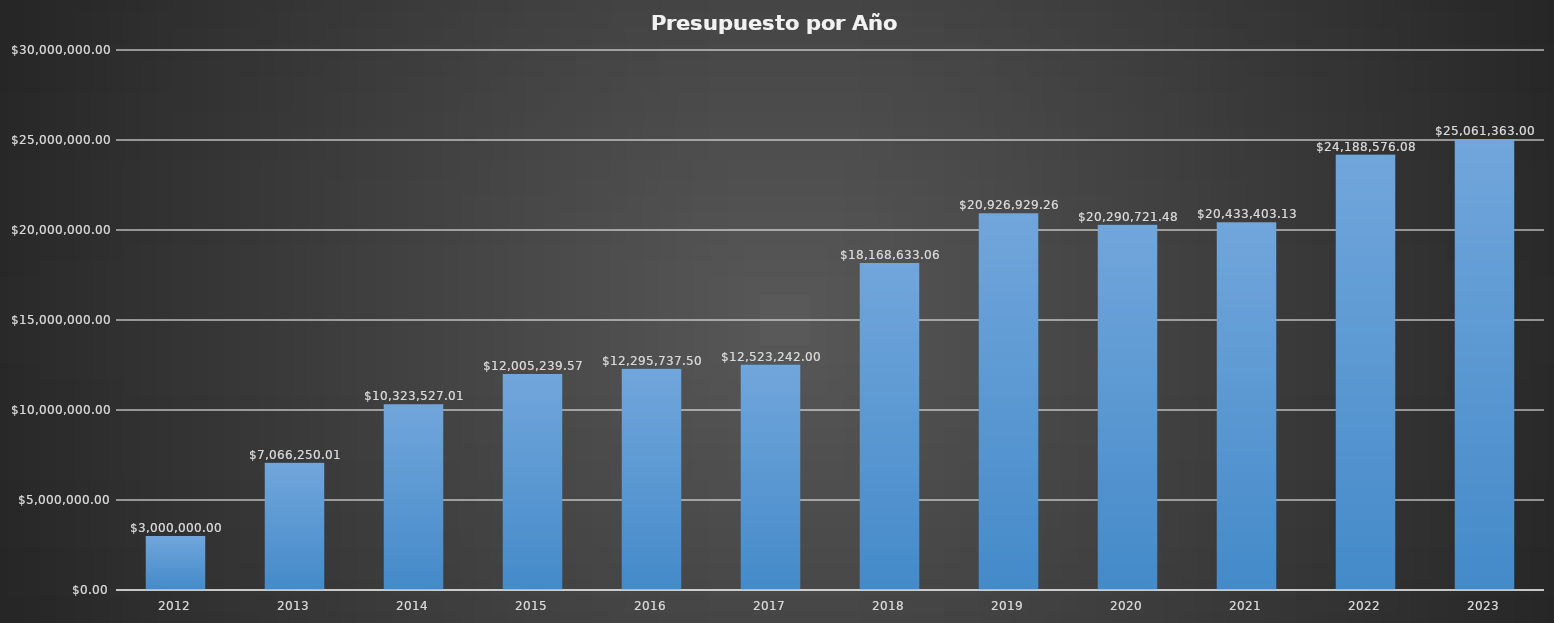
| Category | TOTAL |
|---|---|
| 2012.0 | 3000000 |
| 2013.0 | 7066250.01 |
| 2014.0 | 10323527.01 |
| 2015.0 | 12005239.57 |
| 2016.0 | 12295737.5 |
| 2017.0 | 12523242 |
| 2018.0 | 18168633.06 |
| 2019.0 | 20926929.26 |
| 2020.0 | 20290721.48 |
| 2021.0 | 20433403.13 |
| 2022.0 | 24188576.08 |
| 2023.0 | 25061363 |